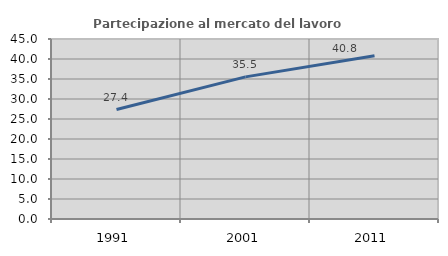
| Category | Partecipazione al mercato del lavoro  femminile |
|---|---|
| 1991.0 | 27.358 |
| 2001.0 | 35.526 |
| 2011.0 | 40.836 |